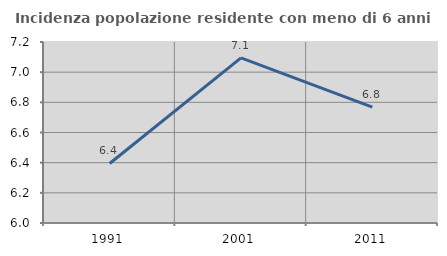
| Category | Incidenza popolazione residente con meno di 6 anni |
|---|---|
| 1991.0 | 6.395 |
| 2001.0 | 7.094 |
| 2011.0 | 6.768 |